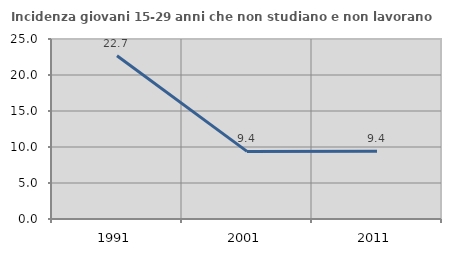
| Category | Incidenza giovani 15-29 anni che non studiano e non lavorano  |
|---|---|
| 1991.0 | 22.665 |
| 2001.0 | 9.388 |
| 2011.0 | 9.402 |